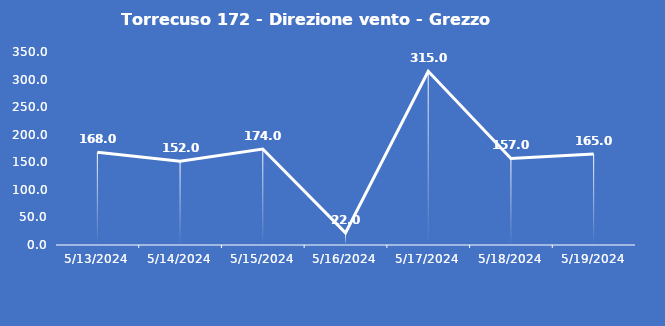
| Category | Torrecuso 172 - Direzione vento - Grezzo (°N) |
|---|---|
| 5/13/24 | 168 |
| 5/14/24 | 152 |
| 5/15/24 | 174 |
| 5/16/24 | 22 |
| 5/17/24 | 315 |
| 5/18/24 | 157 |
| 5/19/24 | 165 |